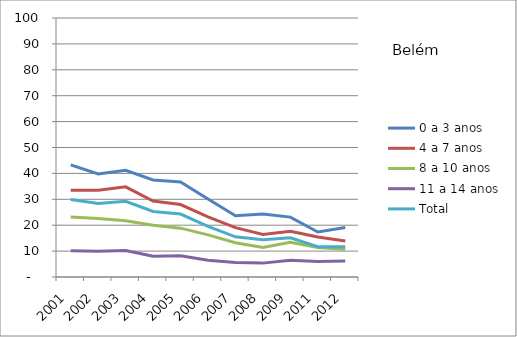
| Category | 0 a 3 anos | 4 a 7 anos | 8 a 10 anos | 11 a 14 anos | Total |
|---|---|---|---|---|---|
| 2001.0 | 43.28 | 33.45 | 23.12 | 10.15 | 29.94 |
| 2002.0 | 39.77 | 33.52 | 22.61 | 9.93 | 28.34 |
| 2003.0 | 41.17 | 34.81 | 21.71 | 10.26 | 29.23 |
| 2004.0 | 37.45 | 29.31 | 19.98 | 8.05 | 25.31 |
| 2005.0 | 36.69 | 27.98 | 18.86 | 8.22 | 24.29 |
| 2006.0 | 30.09 | 23.22 | 16.28 | 6.48 | 19.58 |
| 2007.0 | 23.68 | 19.04 | 13.2 | 5.56 | 15.52 |
| 2008.0 | 24.32 | 16.42 | 11.38 | 5.36 | 14.36 |
| 2009.0 | 23.13 | 17.65 | 13.36 | 6.5 | 15.16 |
| 2011.0 | 17.36 | 15.48 | 11.4 | 6 | 11.68 |
| 2012.0 | 19.1 | 13.93 | 10.76 | 6.13 | 11.72 |